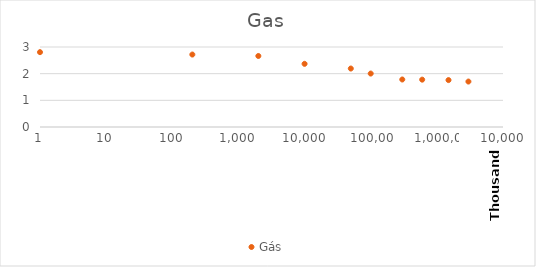
| Category | Gás |
|---|---|
| 1.0 | 2.807 |
| 201.0 | 2.717 |
| 2001.0 | 2.663 |
| 10001.0 | 2.369 |
| 50001.0 | 2.192 |
| 100001.0 | 2.004 |
| 300001.0 | 1.781 |
| 600001.0 | 1.776 |
| 1500001.0 | 1.759 |
| 3000000.0 | 1.704 |